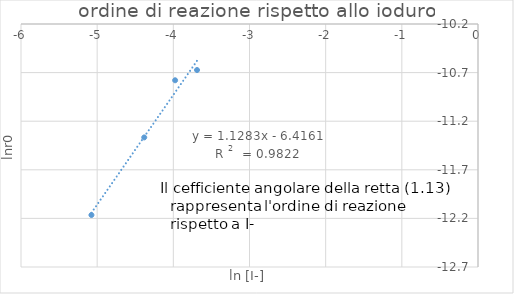
| Category | ioduro |
|---|---|
| -5.075173815233827 | -12.165 |
| -4.382026634673881 | -11.367 |
| -3.9765615265657175 | -10.779 |
| -3.6888794541139363 | -10.674 |